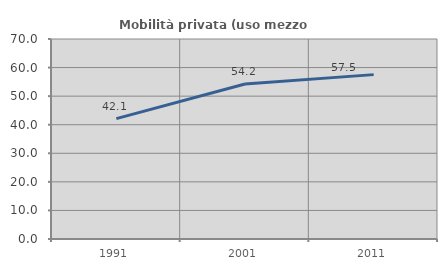
| Category | Mobilità privata (uso mezzo privato) |
|---|---|
| 1991.0 | 42.12 |
| 2001.0 | 54.235 |
| 2011.0 | 57.532 |